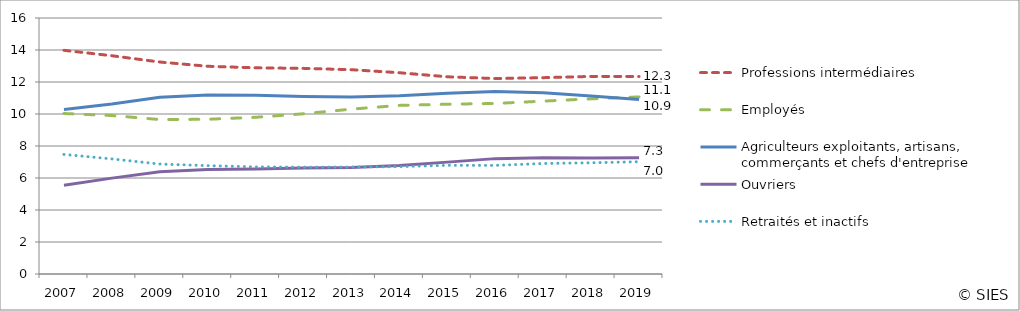
| Category | Professions intermédiaires | Employés | Agriculteurs exploitants, artisans, commerçants et chefs d'entreprise | Ouvriers | Retraités et inactifs |
|---|---|---|---|---|---|
| 2007.0 | 13.98 | 10.03 | 10.283 | 5.552 | 7.475 |
| 2008.0 | 13.641 | 9.906 | 10.626 | 5.993 | 7.192 |
| 2009.0 | 13.248 | 9.653 | 11.044 | 6.384 | 6.872 |
| 2010.0 | 12.983 | 9.67 | 11.194 | 6.529 | 6.771 |
| 2011.0 | 12.886 | 9.795 | 11.17 | 6.562 | 6.695 |
| 2012.0 | 12.852 | 10.014 | 11.1 | 6.618 | 6.675 |
| 2013.0 | 12.769 | 10.305 | 11.056 | 6.654 | 6.685 |
| 2014.0 | 12.579 | 10.538 | 11.135 | 6.781 | 6.709 |
| 2015.0 | 12.325 | 10.612 | 11.302 | 6.992 | 6.793 |
| 2016.0 | 12.216 | 10.659 | 11.4 | 7.211 | 6.788 |
| 2017.0 | 12.271 | 10.804 | 11.326 | 7.264 | 6.906 |
| 2018.0 | 12.349 | 10.948 | 11.127 | 7.246 | 6.95 |
| 2019.0 | 12.344 | 11.068 | 10.912 | 7.272 | 7.018 |